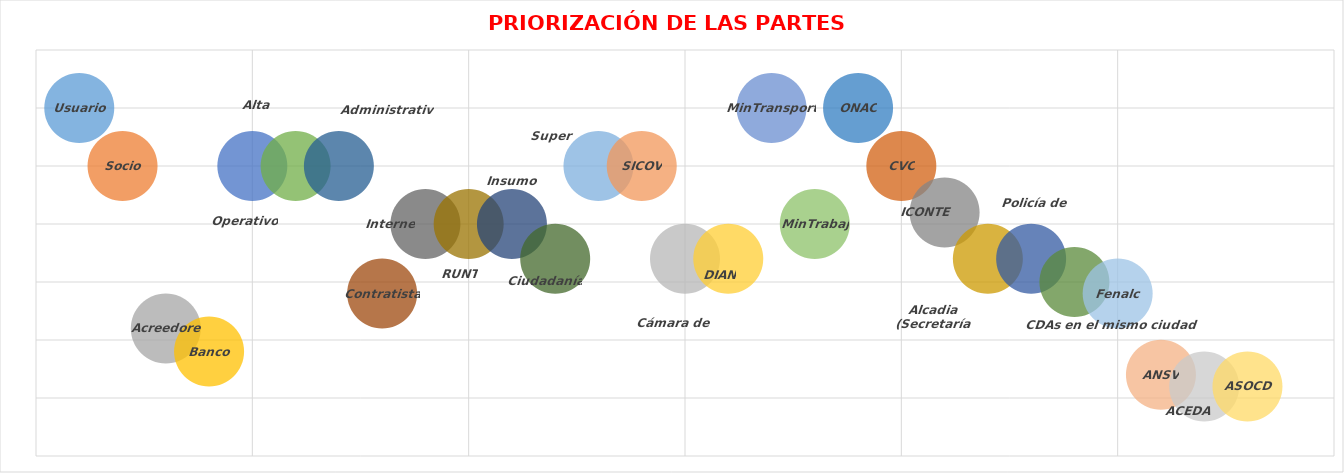
| Category | Series 0 |
|---|---|
| 0 | 25 |
| 1 | 20 |
| 2 | 6 |
| 3 | 4 |
| 4 | 20 |
| 5 | 20 |
| 6 | 20 |
| 7 | 9 |
| 8 | 15 |
| 9 | 15 |
| 10 | 15 |
| 11 | 12 |
| 12 | 20 |
| 13 | 20 |
| 14 | 12 |
| 15 | 12 |
| 16 | 25 |
| 17 | 15 |
| 18 | 25 |
| 19 | 20 |
| 20 | 16 |
| 21 | 12 |
| 22 | 12 |
| 23 | 10 |
| 24 | 9 |
| 25 | 2 |
| 26 | 1 |
| 27 | 1 |